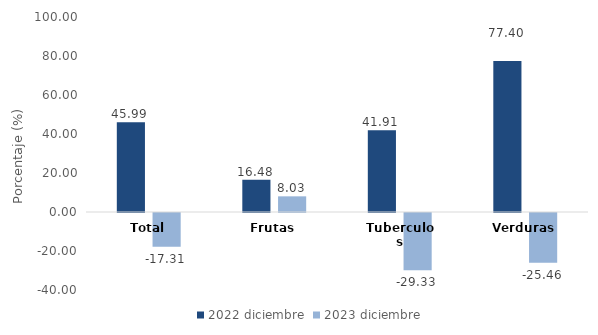
| Category | 2022 | 2023 |
|---|---|---|
| Total | 45.988 | -17.313 |
| Frutas | 16.477 | 8.027 |
| Tuberculos | 41.911 | -29.33 |
| Verduras | 77.399 | -25.459 |